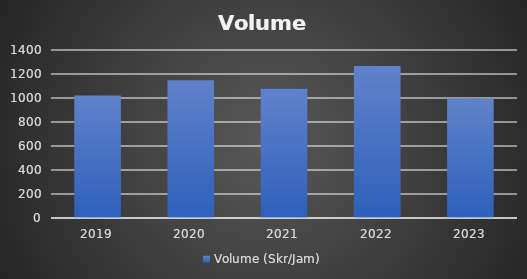
| Category | Volume (Skr/Jam) |
|---|---|
| 2019.0 | 1021.643 |
| 2020.0 | 1148.91 |
| 2021.0 | 1078.91 |
| 2022.0 | 1267 |
| 2023.0 | 996.286 |